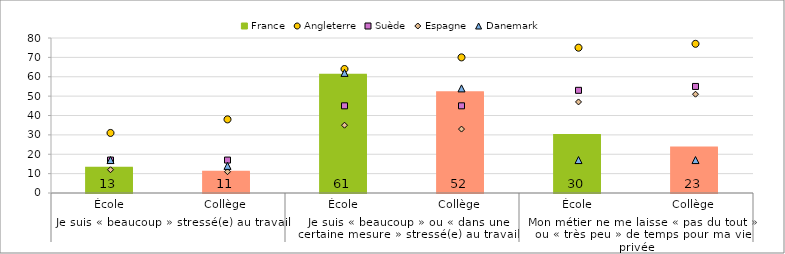
| Category | France |
|---|---|
| 0 | 13 |
| 1 | 11 |
| 2 | 61 |
| 3 | 52 |
| 4 | 30 |
| 5 | 23.465 |